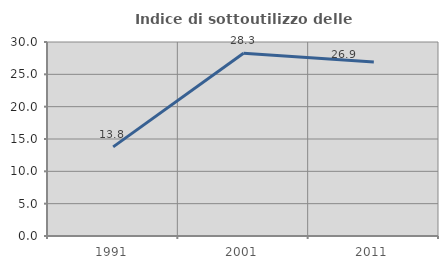
| Category | Indice di sottoutilizzo delle abitazioni  |
|---|---|
| 1991.0 | 13.784 |
| 2001.0 | 28.255 |
| 2011.0 | 26.911 |